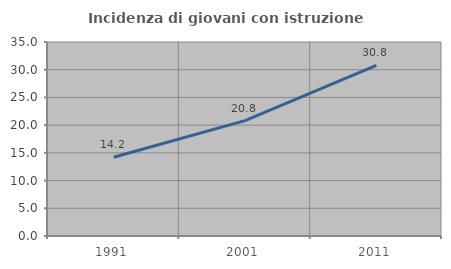
| Category | Incidenza di giovani con istruzione universitaria |
|---|---|
| 1991.0 | 14.199 |
| 2001.0 | 20.82 |
| 2011.0 | 30.768 |